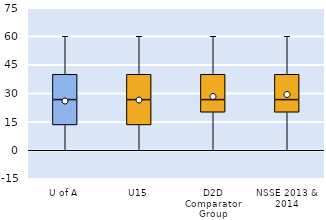
| Category | 25th | 50th | 75th |
|---|---|---|---|
| U of A | 13.333 | 13.333 | 13.333 |
| U15 | 13.333 | 13.333 | 13.333 |
| D2D Comparator Group | 20 | 6.667 | 13.333 |
| NSSE 2013 & 2014 | 20 | 6.667 | 13.333 |